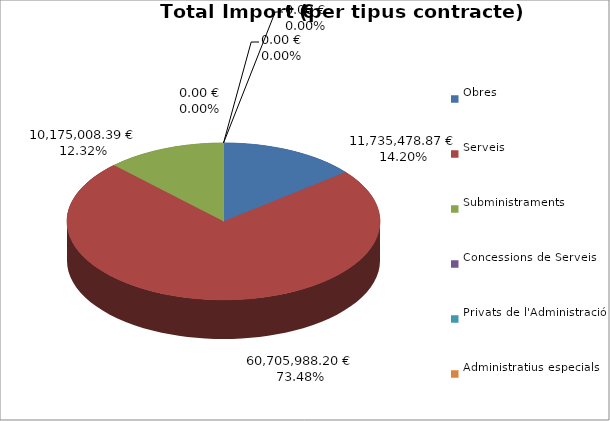
| Category | Total preu
(amb IVA) |
|---|---|
| Obres | 11735478.87 |
| Serveis | 60705988.204 |
| Subministraments | 10175008.386 |
| Concessions de Serveis | 0 |
| Privats de l'Administració | 0 |
| Administratius especials | 0 |